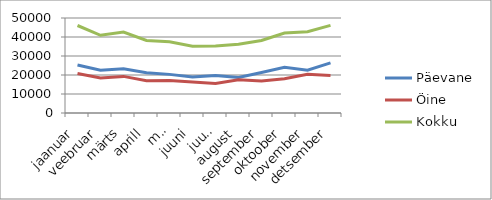
| Category | Päevane | Öine | Kokku |
|---|---|---|---|
| jaanuar | 25305 | 20748.6 | 46053.6 |
| veebruar | 22478.3 | 18435.9 | 40914.2 |
| märts | 23307.6 | 19266.1 | 42573.7 |
| aprill | 21182.7 | 17024.5 | 38207.2 |
| mai | 20327.1 | 17121.6 | 37448.7 |
| juuni | 18914.6 | 16259.4 | 35174 |
| juuli | 19742.5 | 15527.3 | 35269.8 |
| august | 18697.3 | 17456.4 | 36153.7 |
| september | 21301.8 | 16853.1 | 38154.9 |
| oktoober | 24091.2 | 18035.8 | 42127 |
| november | 22476.1 | 20336.5 | 42812.6 |
| detsember | 26403.1 | 19712.4 | 46115.5 |